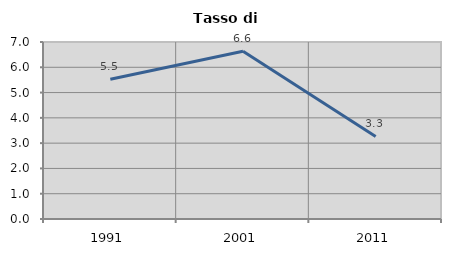
| Category | Tasso di disoccupazione   |
|---|---|
| 1991.0 | 5.53 |
| 2001.0 | 6.636 |
| 2011.0 | 3.263 |